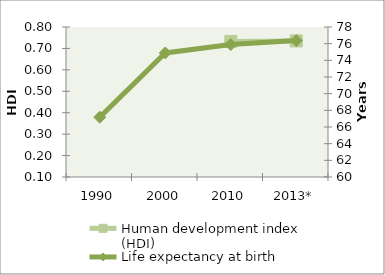
| Category | Human development index (HDI) |
|---|---|
| 1990 | 0 |
| 2000 | 0 |
| 2010 | 0.733 |
| 2013* | 0.735 |